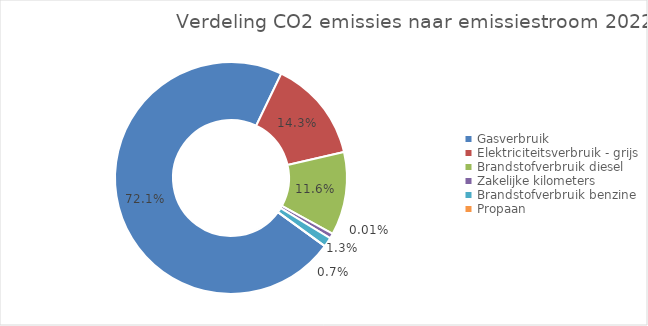
| Category | categorie |
|---|---|
| Gasverbruik | 2735.124 |
| Elektriciteitsverbruik - grijs | 540.311 |
| Brandstofverbruik diesel | 439.755 |
| Zakelijke kilometers | 26.418 |
| Brandstofverbruik benzine | 49.582 |
| Propaan | 0.209 |